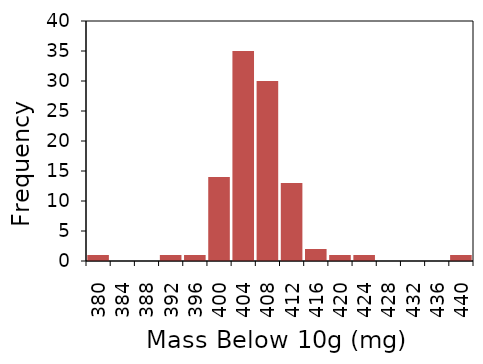
| Category | Series 1 |
|---|---|
| 380.0 | 1 |
| 384.0 | 0 |
| 388.0 | 0 |
| 392.0 | 1 |
| 396.0 | 1 |
| 400.0 | 14 |
| 404.0 | 35 |
| 408.0 | 30 |
| 412.0 | 13 |
| 416.0 | 2 |
| 420.0 | 1 |
| 424.0 | 1 |
| 428.0 | 0 |
| 432.0 | 0 |
| 436.0 | 0 |
| 440.0 | 1 |